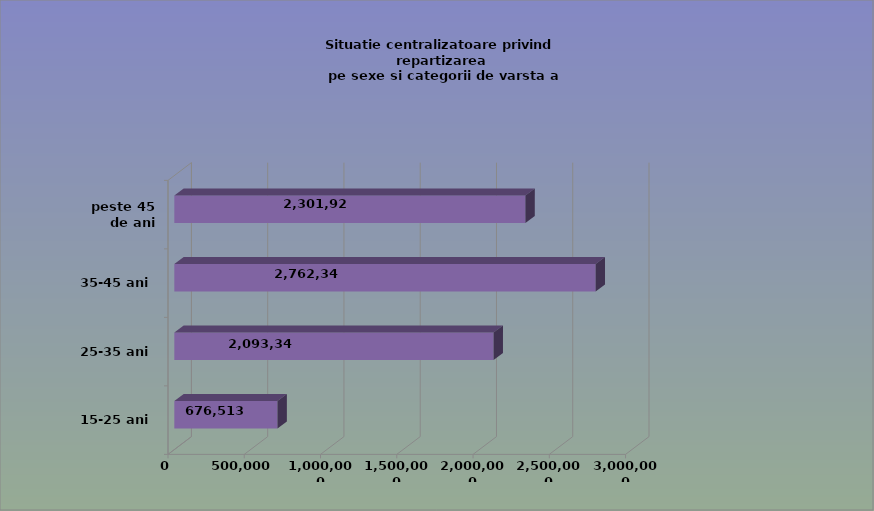
| Category | 15-25 ani 25-35 ani 35-45 ani peste 45 de ani |
|---|---|
| 15-25 ani | 676513 |
| 25-35 ani | 2093344 |
| 35-45 ani | 2762346 |
| peste 45 de ani | 2301928 |